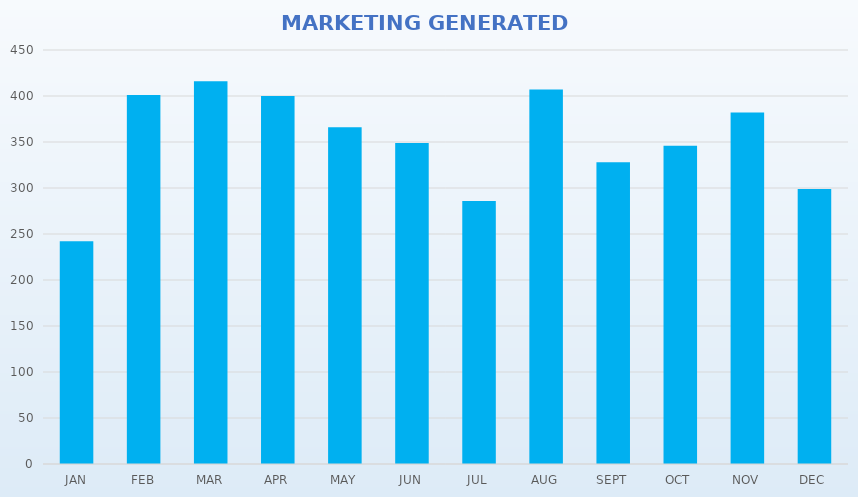
| Category | Series 0 |
|---|---|
| JAN | 242 |
| FEB | 401 |
| MAR | 416 |
| APR | 400 |
| MAY | 366 |
| JUN | 349 |
| JUL | 286 |
| AUG | 407 |
| SEPT | 328 |
| OCT | 346 |
| NOV | 382 |
| DEC | 299 |